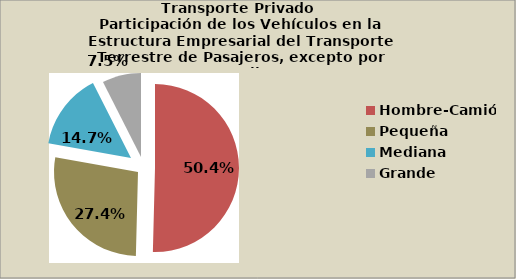
| Category | Series 0 |
|---|---|
| Hombre-Camión | 50.403 |
| Pequeña | 27.407 |
| Mediana | 14.711 |
| Grande | 7.479 |